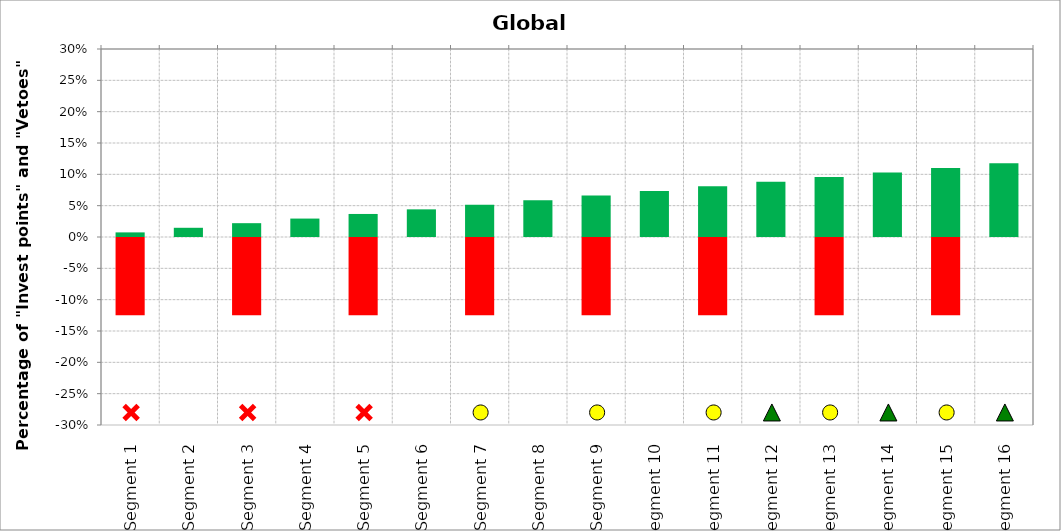
| Category | Invest | Veto |
|---|---|---|
| Segment 1 | 0.007 | -0.125 |
| Segment 2 | 0.015 | 0 |
| Segment 3 | 0.022 | -0.125 |
| Segment 4 | 0.029 | 0 |
| Segment 5 | 0.037 | -0.125 |
| Segment 6 | 0.044 | 0 |
| Segment 7 | 0.051 | -0.125 |
| Segment 8 | 0.059 | 0 |
| Segment 9 | 0.066 | -0.125 |
| Segment 10 | 0.074 | 0 |
| Segment 11 | 0.081 | -0.125 |
| Segment 12 | 0.088 | 0 |
| Segment 13 | 0.096 | -0.125 |
| Segment 14 | 0.103 | 0 |
| Segment 15 | 0.11 | -0.125 |
| Segment 16 | 0.118 | 0 |